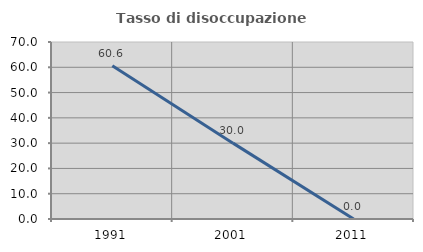
| Category | Tasso di disoccupazione giovanile  |
|---|---|
| 1991.0 | 60.606 |
| 2001.0 | 30 |
| 2011.0 | 0 |